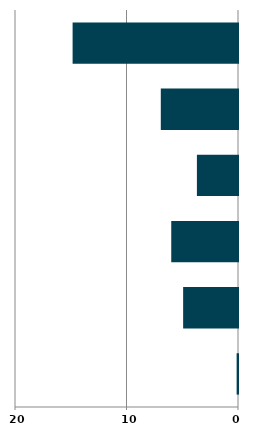
| Category | Series 0 |
|---|---|
| 0 | 0.124 |
| 1 | 4.92 |
| 2 | 5.987 |
| 3 | 3.685 |
| 4 | 6.924 |
| 5 | 14.834 |